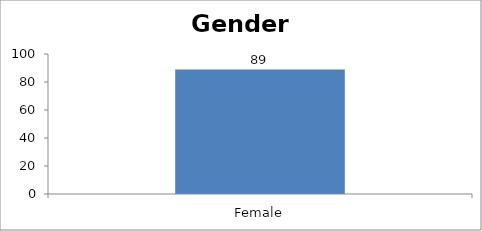
| Category | Gender |
|---|---|
| Female | 89 |